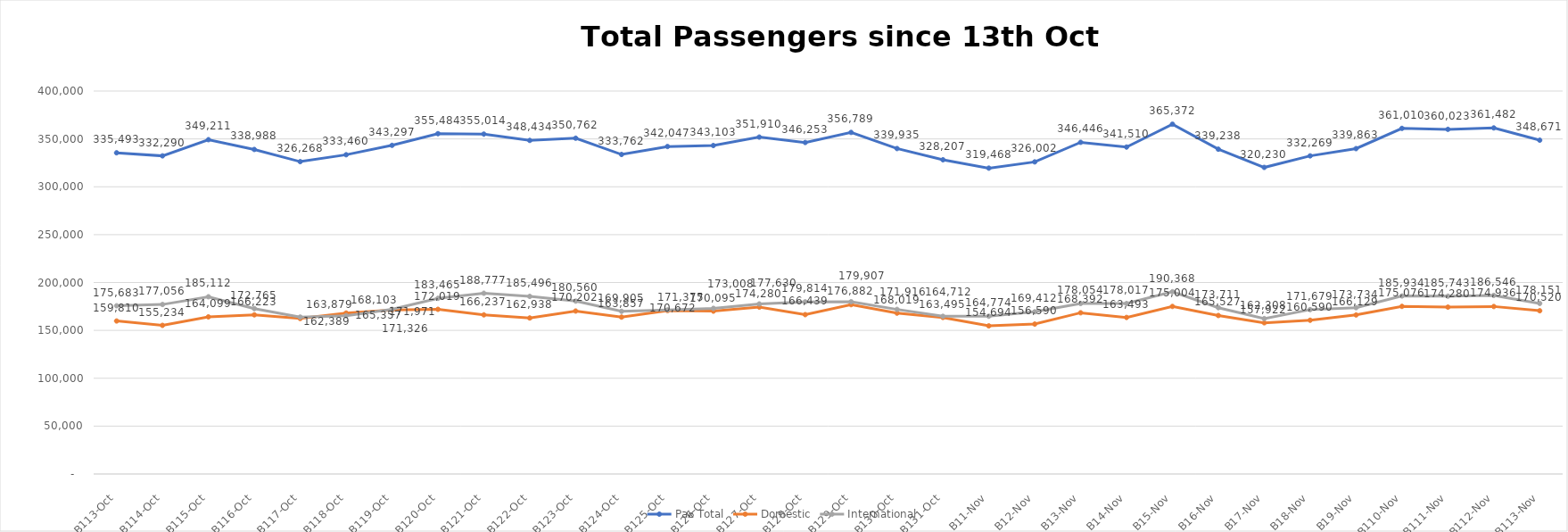
| Category | Pax Total | Domestic | International |
|---|---|---|---|
| 2023-10-13 | 335493 | 159810 | 175683 |
| 2023-10-14 | 332290 | 155234 | 177056 |
| 2023-10-15 | 349211 | 164099 | 185112 |
| 2023-10-16 | 338988 | 166223 | 172765 |
| 2023-10-17 | 326268 | 162389 | 163879 |
| 2023-10-18 | 333460 | 168103 | 165357 |
| 2023-10-19 | 343297 | 171326 | 171971 |
| 2023-10-20 | 355484 | 172019 | 183465 |
| 2023-10-21 | 355014 | 166237 | 188777 |
| 2023-10-22 | 348434 | 162938 | 185496 |
| 2023-10-23 | 350762 | 170202 | 180560 |
| 2023-10-24 | 333762 | 163857 | 169905 |
| 2023-10-25 | 342047 | 170672 | 171375 |
| 2023-10-26 | 343103 | 170095 | 173008 |
| 2023-10-27 | 351910 | 174280 | 177630 |
| 2023-10-28 | 346253 | 166439 | 179814 |
| 2023-10-29 | 356789 | 176882 | 179907 |
| 2023-10-30 | 339935 | 168019 | 171916 |
| 2023-10-31 | 328207 | 163495 | 164712 |
| 2023-11-01 | 319468 | 154694 | 164774 |
| 2023-11-02 | 326002 | 156590 | 169412 |
| 2023-11-03 | 346446 | 168392 | 178054 |
| 2023-11-04 | 341510 | 163493 | 178017 |
| 2023-11-05 | 365372 | 175004 | 190368 |
| 2023-11-06 | 339238 | 165527 | 173711 |
| 2023-11-07 | 320230 | 157922 | 162308 |
| 2023-11-08 | 332269 | 160590 | 171679 |
| 2023-11-09 | 339863 | 166129 | 173734 |
| 2023-11-10 | 361010 | 175076 | 185934 |
| 2023-11-11 | 360023 | 174280 | 185743 |
| 2023-11-12 | 361482 | 174936 | 186546 |
| 2023-11-13 | 348671 | 170520 | 178151 |